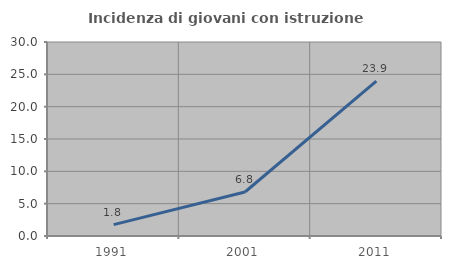
| Category | Incidenza di giovani con istruzione universitaria |
|---|---|
| 1991.0 | 1.754 |
| 2001.0 | 6.803 |
| 2011.0 | 23.944 |